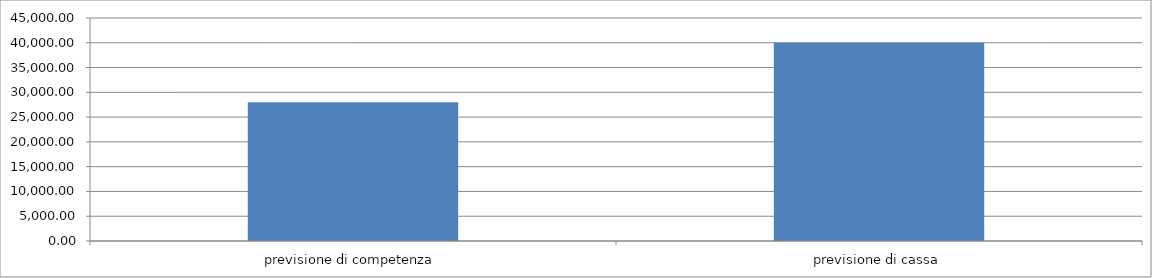
| Category | Series 0 |
|---|---|
| previsione di competenza | 28000 |
| previsione di cassa | 40000 |